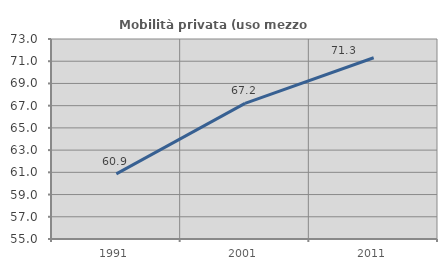
| Category | Mobilità privata (uso mezzo privato) |
|---|---|
| 1991.0 | 60.864 |
| 2001.0 | 67.205 |
| 2011.0 | 71.316 |